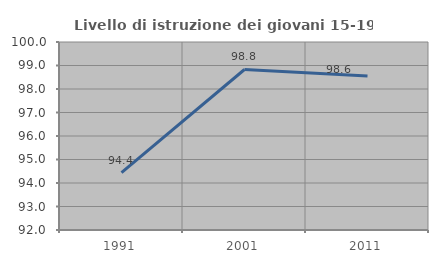
| Category | Livello di istruzione dei giovani 15-19 anni |
|---|---|
| 1991.0 | 94.444 |
| 2001.0 | 98.83 |
| 2011.0 | 98.551 |